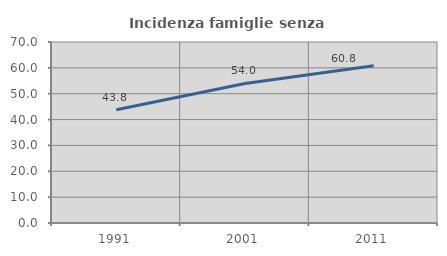
| Category | Incidenza famiglie senza nuclei |
|---|---|
| 1991.0 | 43.794 |
| 2001.0 | 53.963 |
| 2011.0 | 60.808 |